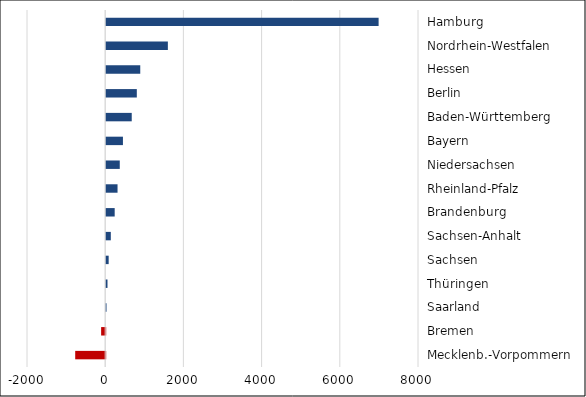
| Category | Series 0 |
|---|---|
| Mecklenb.-Vorpommern | -767 |
| Bremen | -104 |
| Saarland | 8 |
| Thüringen | 33 |
| Sachsen | 63 |
| Sachsen-Anhalt | 118 |
| Brandenburg | 217 |
| Rheinland-Pfalz | 290 |
| Niedersachsen | 347 |
| Bayern | 428 |
| Baden-Württemberg | 653 |
| Berlin | 783 |
| Hessen | 871 |
| Nordrhein-Westfalen | 1577 |
| Hamburg | 6967 |